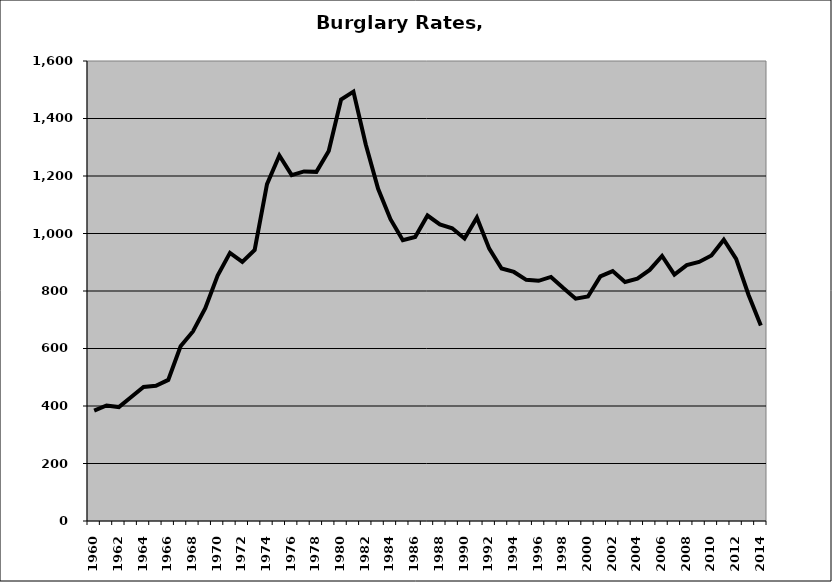
| Category | Burglary |
|---|---|
| 1960.0 | 383.871 |
| 1961.0 | 401.752 |
| 1962.0 | 396.296 |
| 1963.0 | 431.515 |
| 1964.0 | 466.337 |
| 1965.0 | 470.464 |
| 1966.0 | 490.704 |
| 1967.0 | 607.573 |
| 1968.0 | 659.418 |
| 1969.0 | 740.121 |
| 1970.0 | 853.857 |
| 1971.0 | 932.641 |
| 1972.0 | 901.289 |
| 1973.0 | 942.969 |
| 1974.0 | 1171.845 |
| 1975.0 | 1271.41 |
| 1976.0 | 1203.162 |
| 1977.0 | 1215.97 |
| 1978.0 | 1214.466 |
| 1979.0 | 1287.187 |
| 1980.0 | 1466.303 |
| 1981.0 | 1493.606 |
| 1982.0 | 1309.573 |
| 1983.0 | 1155.583 |
| 1984.0 | 1049.916 |
| 1985.0 | 976.545 |
| 1986.0 | 987.835 |
| 1987.0 | 1062.5 |
| 1988.0 | 1031.365 |
| 1989.0 | 1018.218 |
| 1990.0 | 982.519 |
| 1991.0 | 1055.151 |
| 1992.0 | 947.322 |
| 1993.0 | 878.135 |
| 1994.0 | 866.285 |
| 1995.0 | 838.84 |
| 1996.0 | 835.371 |
| 1997.0 | 849.026 |
| 1998.0 | 810.108 |
| 1999.0 | 773.081 |
| 2000.0 | 780.718 |
| 2001.0 | 850.85 |
| 2002.0 | 869.196 |
| 2003.0 | 831.314 |
| 2004.0 | 842.941 |
| 2005.0 | 873.383 |
| 2006.0 | 921.789 |
| 2007.0 | 857.336 |
| 2008.0 | 890.14 |
| 2009.0 | 901.085 |
| 2010.0 | 923.339 |
| 2011.0 | 978.26 |
| 2012.0 | 911.553 |
| 2013.0 | 787.158 |
| 2014.0 | 680.04 |